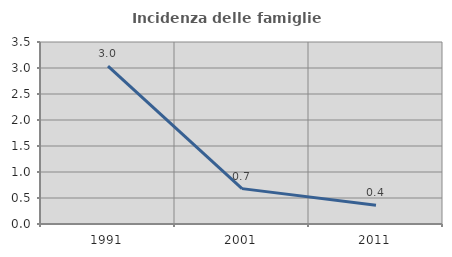
| Category | Incidenza delle famiglie numerose |
|---|---|
| 1991.0 | 3.035 |
| 2001.0 | 0.68 |
| 2011.0 | 0.362 |